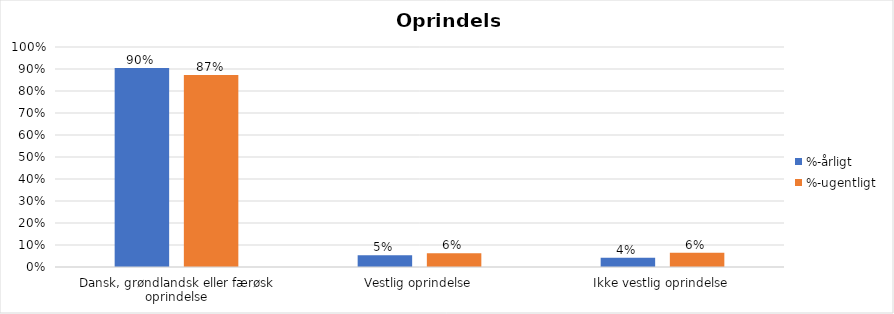
| Category | %-årligt | %-ugentligt |
|---|---|---|
| Dansk, grøndlandsk eller færøsk oprindelse | 0.905 | 0.873 |
| Vestlig oprindelse | 0.053 | 0.062 |
| Ikke vestlig oprindelse | 0.042 | 0.064 |